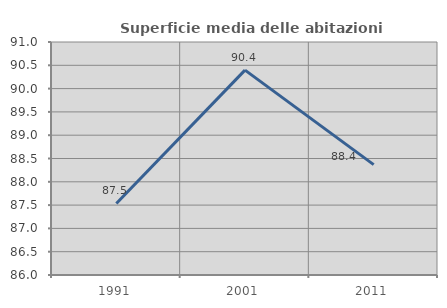
| Category | Superficie media delle abitazioni occupate |
|---|---|
| 1991.0 | 87.535 |
| 2001.0 | 90.397 |
| 2011.0 | 88.369 |